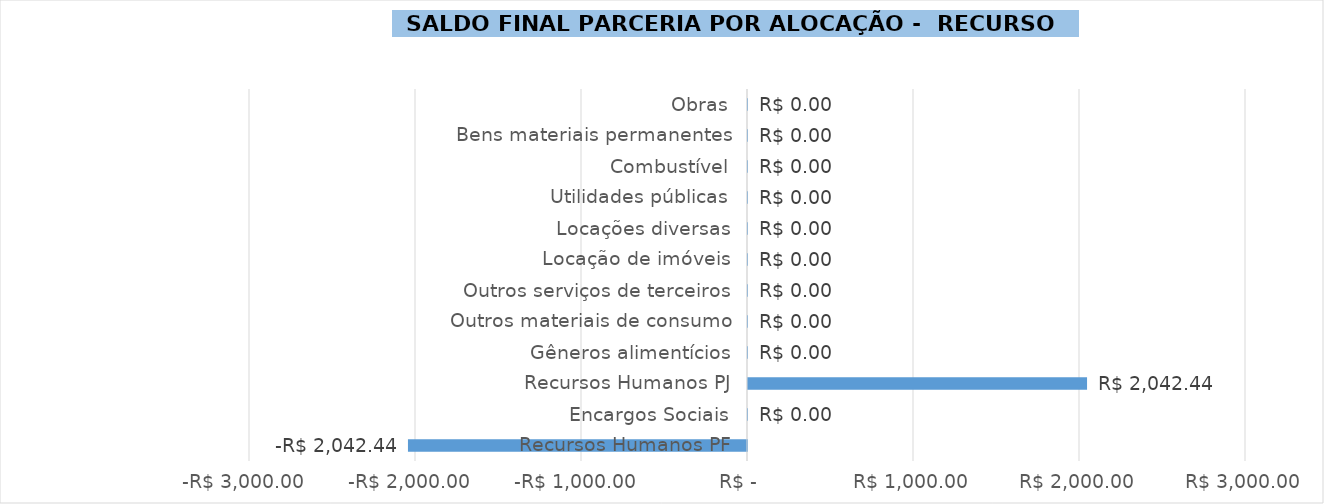
| Category | Saldo Final 2018 |
|---|---|
| Recursos Humanos PF | -2042.441 |
| Encargos Sociais | 0 |
| Recursos Humanos PJ | 2042.441 |
| Gêneros alimentícios | 0 |
| Outros materiais de consumo | 0 |
| Outros serviços de terceiros | 0 |
| Locação de imóveis | 0 |
| Locações diversas | 0 |
| Utilidades públicas | 0 |
| Combustível | 0 |
| Bens materiais permanentes | 0 |
| Obras | 0 |